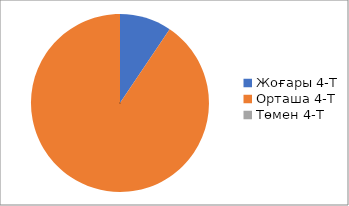
| Category | Series 0 |
|---|---|
| 0 | 4.167 |
| 1 | 40.064 |
| 2 | 0 |